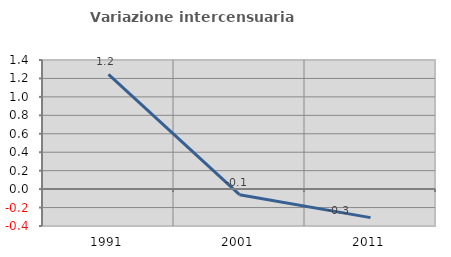
| Category | Variazione intercensuaria annua |
|---|---|
| 1991.0 | 1.244 |
| 2001.0 | -0.061 |
| 2011.0 | -0.309 |